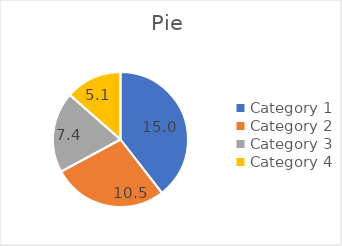
| Category | Slice Size |
|---|---|
| Category 1 | 15 |
| Category 2 | 10.5 |
| Category 3 | 7.35 |
| Category 4 | 5.145 |